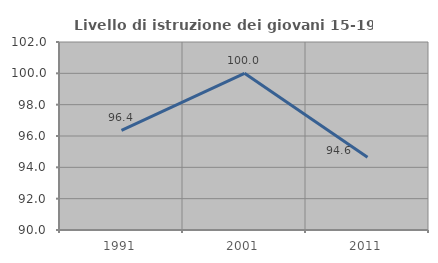
| Category | Livello di istruzione dei giovani 15-19 anni |
|---|---|
| 1991.0 | 96.356 |
| 2001.0 | 100 |
| 2011.0 | 94.643 |